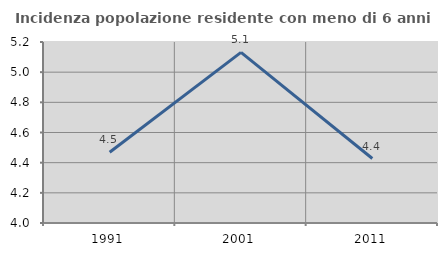
| Category | Incidenza popolazione residente con meno di 6 anni |
|---|---|
| 1991.0 | 4.469 |
| 2001.0 | 5.131 |
| 2011.0 | 4.427 |